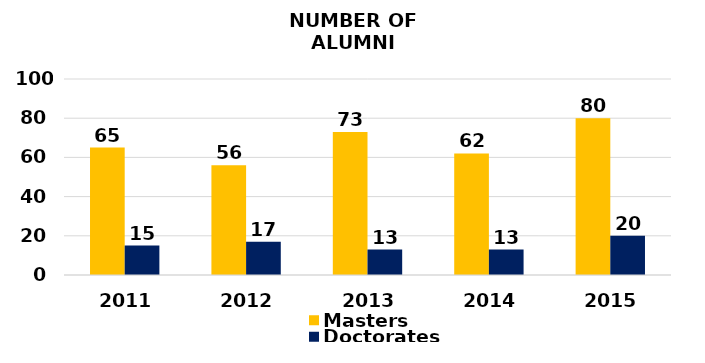
| Category | Masters | Doctorates |
|---|---|---|
| 2011.0 | 65 | 15 |
| 2012.0 | 56 | 17 |
| 2013.0 | 73 | 13 |
| 2014.0 | 62 | 13 |
| 2015.0 | 80 | 20 |